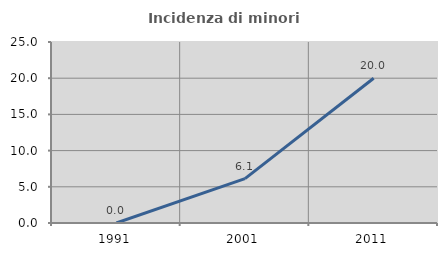
| Category | Incidenza di minori stranieri |
|---|---|
| 1991.0 | 0 |
| 2001.0 | 6.122 |
| 2011.0 | 20 |